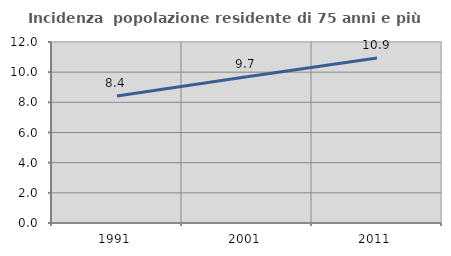
| Category | Incidenza  popolazione residente di 75 anni e più |
|---|---|
| 1991.0 | 8.422 |
| 2001.0 | 9.7 |
| 2011.0 | 10.938 |